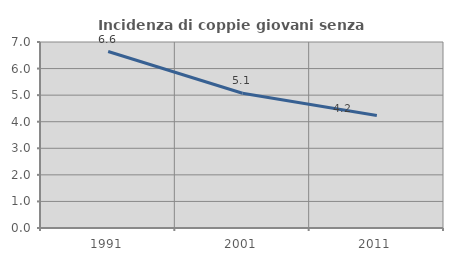
| Category | Incidenza di coppie giovani senza figli |
|---|---|
| 1991.0 | 6.641 |
| 2001.0 | 5.072 |
| 2011.0 | 4.231 |